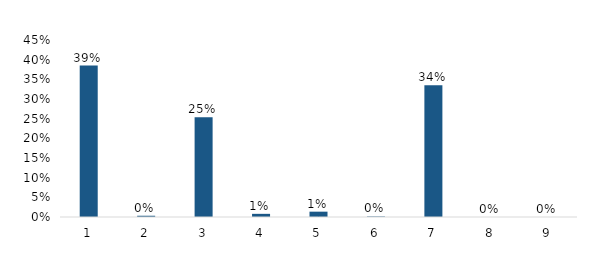
| Category | 2021 |
|---|---|
| 1.0 | 0.385 |
| 2.0 | 0.003 |
| 3.0 | 0.254 |
| 4.0 | 0.008 |
| 5.0 | 0.014 |
| 6.0 | 0.001 |
| 7.0 | 0.335 |
| 8.0 | 0 |
| 9.0 | 0 |